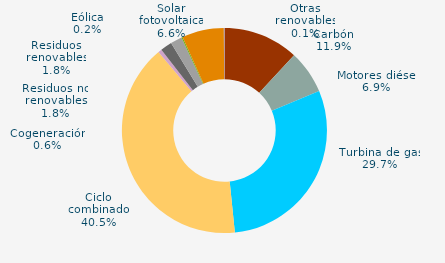
| Category | Series 0 |
|---|---|
| Carbón | 11.864 |
| Motores diésel | 6.857 |
| Turbina de gas | 29.666 |
| Ciclo combinado | 40.478 |
| Generación auxiliar | 0 |
| Cogeneración | 0.567 |
| Residuos no renovables | 1.84 |
| Residuos renovables | 1.84 |
| Eólica | 0.179 |
| Solar fotovoltaica | 6.605 |
| Otras renovables | 0.105 |